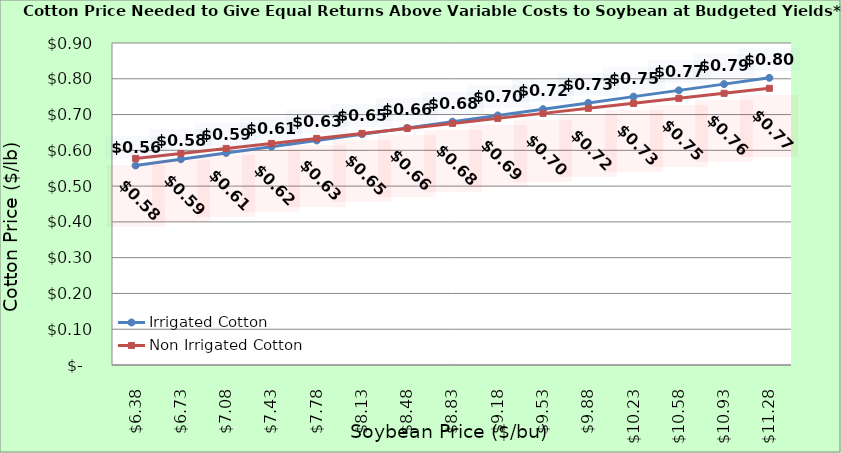
| Category | Irrigated Cotton | Non Irrigated Cotton |
|---|---|---|
| 6.380000000000003 | 0.558 | 0.577 |
| 6.730000000000002 | 0.575 | 0.591 |
| 7.080000000000002 | 0.593 | 0.605 |
| 7.4300000000000015 | 0.61 | 0.619 |
| 7.780000000000001 | 0.628 | 0.633 |
| 8.13 | 0.645 | 0.647 |
| 8.48 | 0.663 | 0.661 |
| 8.83 | 0.68 | 0.675 |
| 9.18 | 0.698 | 0.689 |
| 9.53 | 0.715 | 0.703 |
| 9.879999999999999 | 0.733 | 0.717 |
| 10.229999999999999 | 0.75 | 0.731 |
| 10.579999999999998 | 0.768 | 0.745 |
| 10.929999999999998 | 0.785 | 0.759 |
| 11.279999999999998 | 0.803 | 0.773 |